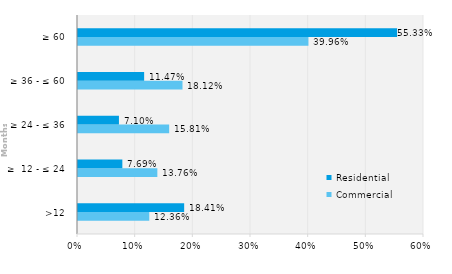
| Category | Commercial | Residential |
|---|---|---|
| >12 | 0.124 | 0.184 |
| ≥  12 - ≤ 24 | 0.138 | 0.077 |
| ≥ 24 - ≤ 36 | 0.158 | 0.071 |
| ≥ 36 - ≤ 60 | 0.181 | 0.115 |
| ≥ 60 | 0.4 | 0.553 |